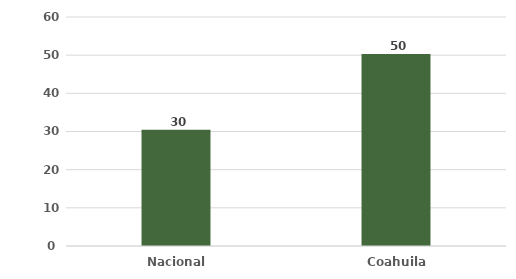
| Category | Series 0 |
|---|---|
| Nacional  | 30455.678 |
| Coahuila  | 50306.594 |